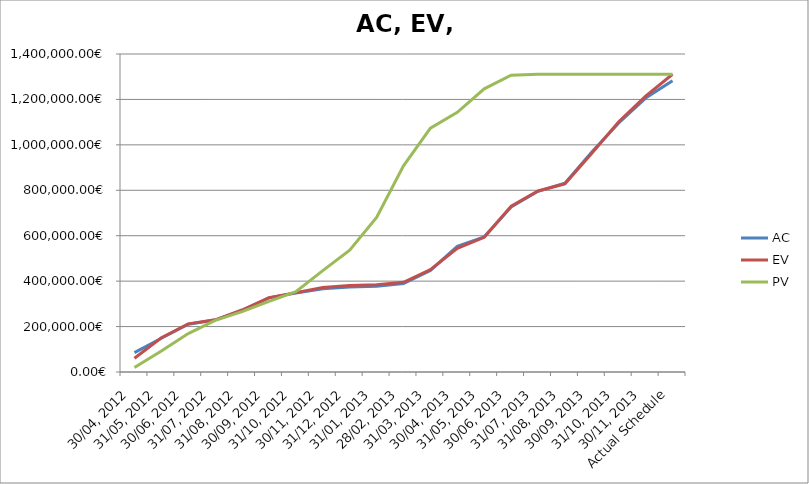
| Category | AC | EV | PV |
|---|---|---|---|
| 30/04, 2012 | 85203.308 | 60634.442 | 19800 |
| 31/05, 2012 | 148645.553 | 150700.975 | 92226.848 |
| 30/06, 2012 | 210595.579 | 211900.348 | 169270.025 |
| 31/07, 2012 | 228759.491 | 229863.961 | 227045.466 |
| 31/08, 2012 | 271464.461 | 272821.88 | 265873.603 |
| 30/09, 2012 | 326531.344 | 327221.807 | 310592.904 |
| 31/10, 2012 | 347661.578 | 349469.9 | 353437.744 |
| 30/11, 2012 | 366368.782 | 371874.378 | 446143.14 |
| 31/12, 2012 | 374404.594 | 380497.818 | 536473.044 |
| 31/01, 2013 | 377642.743 | 383908.299 | 680929.358 |
| 28/02, 2013 | 389299.205 | 394938.476 | 907753.625 |
| 31/03, 2013 | 447330.911 | 450411.105 | 1073594.943 |
| 30/04, 2013 | 553740.318 | 544639.355 | 1142947.917 |
| 31/05, 2013 | 594983.108 | 593085.994 | 1246638.838 |
| 30/06, 2013 | 726076.399 | 729660.878 | 1306660.09 |
| 31/07, 2013 | 795528.625 | 796973.456 | 1310723.46 |
| 31/08, 2013 | 830827.017 | 828548.551 | 1310723.46 |
| 30/09, 2013 | 968668.492 | 963428.525 | 1310723.46 |
| 31/10, 2013 | 1096390.252 | 1101575.615 | 1310723.46 |
| 30/11, 2013 | 1206014.12 | 1214681.36 | 1310723.46 |
| Actual Schedule | 1282185.98 | 1310723.46 | 1310723.46 |